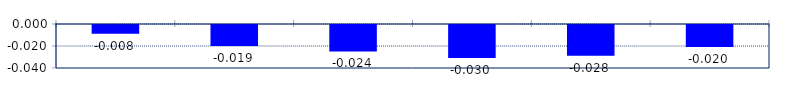
| Category | Series 0 |
|---|---|
| 0 | -0.008 |
| 1 | -0.019 |
| 2 | -0.024 |
| 3 | -0.03 |
| 4 | -0.028 |
| 5 | -0.02 |